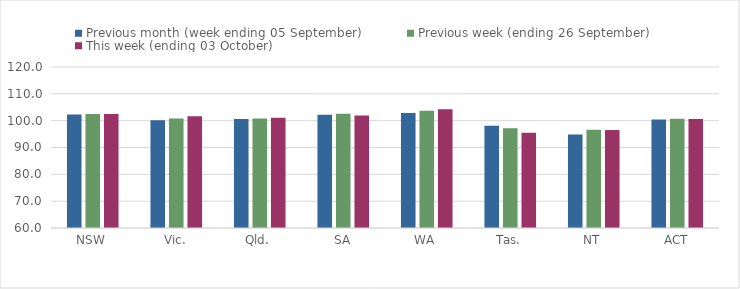
| Category | Previous month (week ending 05 September) | Previous week (ending 26 September) | This week (ending 03 October) |
|---|---|---|---|
| NSW | 102.28 | 102.5 | 102.52 |
| Vic. | 100.12 | 100.77 | 101.61 |
| Qld. | 100.61 | 100.82 | 101.06 |
| SA | 102.22 | 102.56 | 101.89 |
| WA | 102.88 | 103.72 | 104.29 |
| Tas. | 98.09 | 97.15 | 95.52 |
| NT | 94.83 | 96.66 | 96.5 |
| ACT | 100.41 | 100.72 | 100.64 |